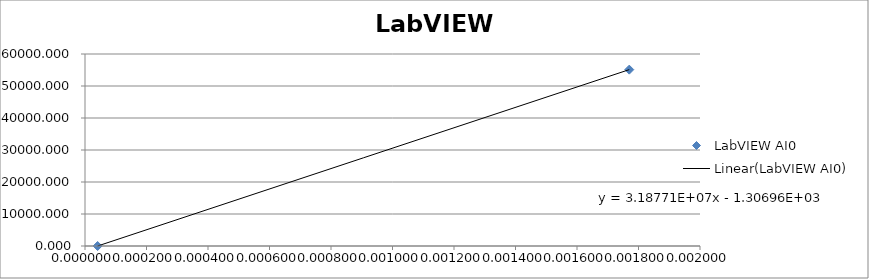
| Category | LabVIEW AI0 |
|---|---|
| 4.1e-05 | 0 |
| nan | 11023.113 |
| nan | 22046.226 |
| nan | 33069.339 |
| nan | 44092.452 |
| 0.00177 | 55115.566 |